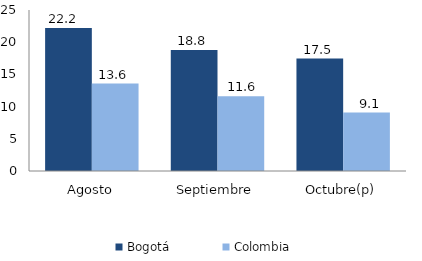
| Category | Bogotá | Colombia |
|---|---|---|
| Agosto | 22.194 | 13.568 |
| Septiembre | 18.782 | 11.609 |
| Octubre(p) | 17.455 | 9.072 |